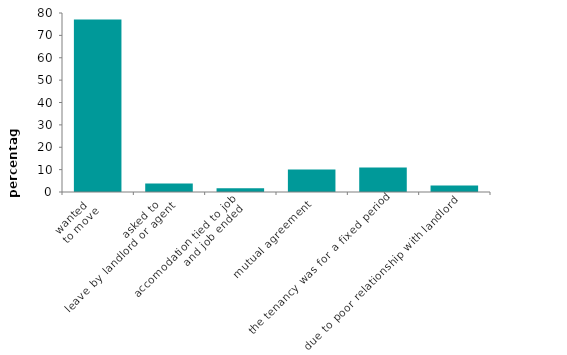
| Category | reason last tenancy ended |
|---|---|
| wanted 
to move | 77.044 |
| asked to 
leave by landlord or agent | 3.837 |
| accomodation tied to job
 and job ended | 1.729 |
| mutual agreement | 10.057 |
| the tenancy was for a fixed period | 10.958 |
| due to poor relationship with landlord | 2.876 |